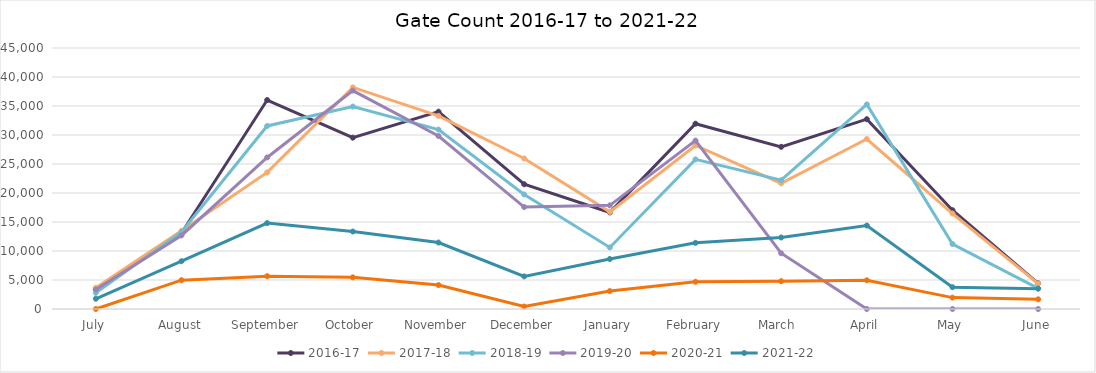
| Category | 2016-17 | 2017-18 | 2018-19 | 2019-20 | 2020-21 | 2021-22 |
|---|---|---|---|---|---|---|
| July | 3392 | 3653 | 2782 | 3363 | 0 | 1767 |
| August | 13096 | 13479 | 13294 | 12682 | 4973 | 8242 |
| September | 36026 | 23551 | 31557 | 26129 | 5666 | 14811 |
| October | 29537 | 38209 | 34902 | 37649 | 5454 | 13359 |
| November | 34023 | 33287 | 30931 | 29822 | 4123 | 11459 |
| December | 21512 | 25951 | 19747 | 17581 | 424 | 5626 |
| January | 16654 | 16743 | 10612 | 17872 | 3091 | 8621 |
| February | 31949 | 28193 | 25793 | 29043 | 4692 | 11403 |
| March  | 27959 | 21661 | 22209 | 9611 | 4801 | 12332 |
| April | 32727 | 29310 | 35279 | 0 | 4952 | 14393 |
| May | 17041 | 16462 | 11203 | 0 | 1964 | 3761 |
| June | 4431 | 4374 | 3544 | 0 | 1676 | 3504 |